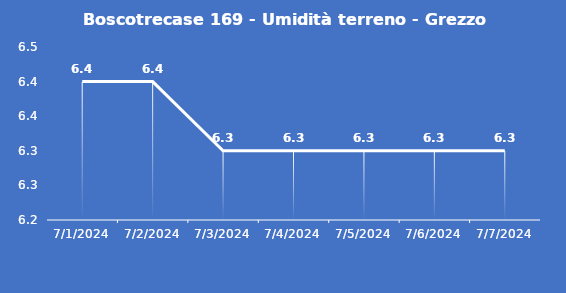
| Category | Boscotrecase 169 - Umidità terreno - Grezzo (%VWC) |
|---|---|
| 7/1/24 | 6.4 |
| 7/2/24 | 6.4 |
| 7/3/24 | 6.3 |
| 7/4/24 | 6.3 |
| 7/5/24 | 6.3 |
| 7/6/24 | 6.3 |
| 7/7/24 | 6.3 |